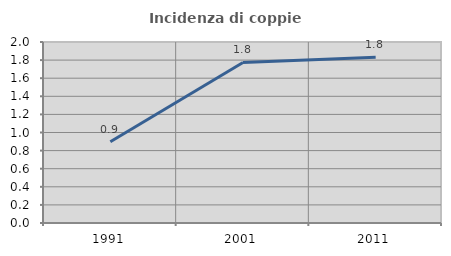
| Category | Incidenza di coppie miste |
|---|---|
| 1991.0 | 0.899 |
| 2001.0 | 1.774 |
| 2011.0 | 1.832 |